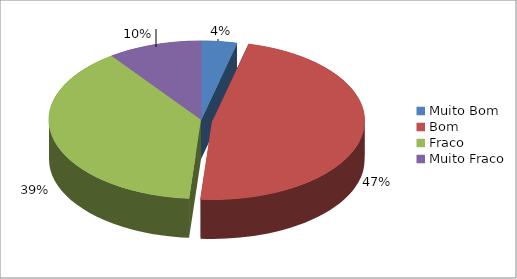
| Category | Series 0 |
|---|---|
| Muito Bom | 3.8 |
| Bom | 47.5 |
| Fraco | 38.8 |
| Muito Fraco | 10 |